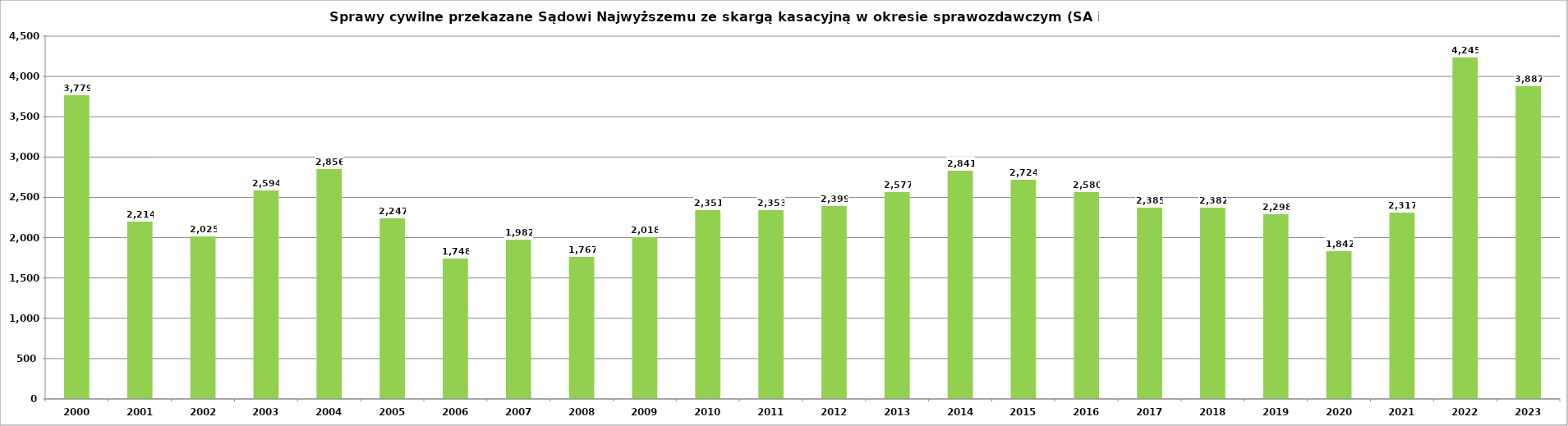
| Category | Series 0 |
|---|---|
| 2000.0 | 3779 |
| 2001.0 | 2214 |
| 2002.0 | 2025 |
| 2003.0 | 2594 |
| 2004.0 | 2856 |
| 2005.0 | 2247 |
| 2006.0 | 1748 |
| 2007.0 | 1982 |
| 2008.0 | 1767 |
| 2009.0 | 2018 |
| 2010.0 | 2351 |
| 2011.0 | 2353 |
| 2012.0 | 2399 |
| 2013.0 | 2577 |
| 2014.0 | 2841 |
| 2015.0 | 2724 |
| 2016.0 | 2580 |
| 2017.0 | 2385 |
| 2018.0 | 2382 |
| 2019.0 | 2298 |
| 2020.0 | 1842 |
| 2021.0 | 2317 |
| 2022.0 | 4245 |
| 2023.0 | 3887 |